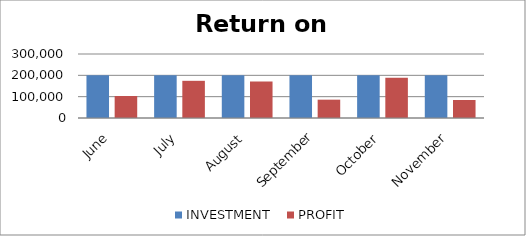
| Category | INVESTMENT  | PROFIT |
|---|---|---|
| June | 200000 | 103075 |
| July | 200000 | 174300 |
| August | 200000 | 171087 |
| September | 200000 | 85937 |
| October | 200000 | 188643 |
| November | 200000 | 84413 |